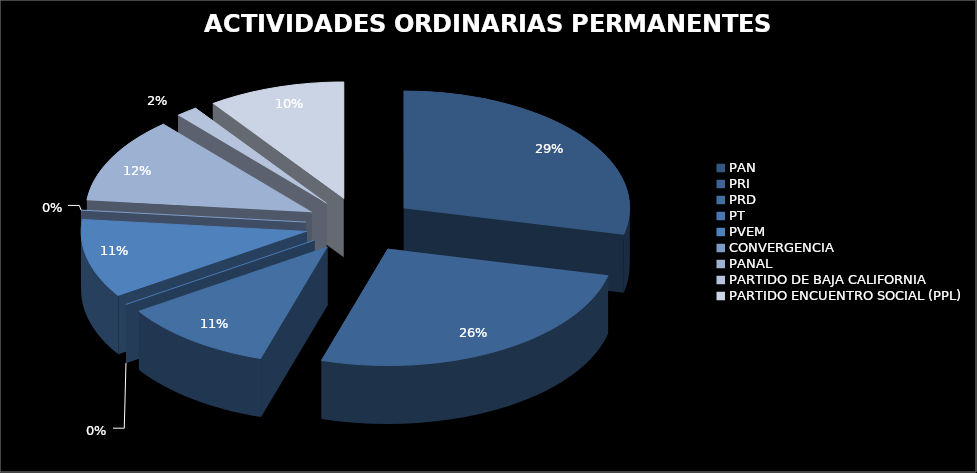
| Category | Series 0 |
|---|---|
| PAN | 2951585.12 |
| PRI | 2692201.99 |
| PRD | 1130315.8 |
| PT | 0 |
| PVEM | 1126243.42 |
| CONVERGENCIA | 0 |
| PANAL | 1233148.4 |
| PARTIDO DE BAJA CALIFORNIA | 160357.47 |
| PARTIDO ENCUENTRO SOCIAL (PPL) | 1013997.07 |